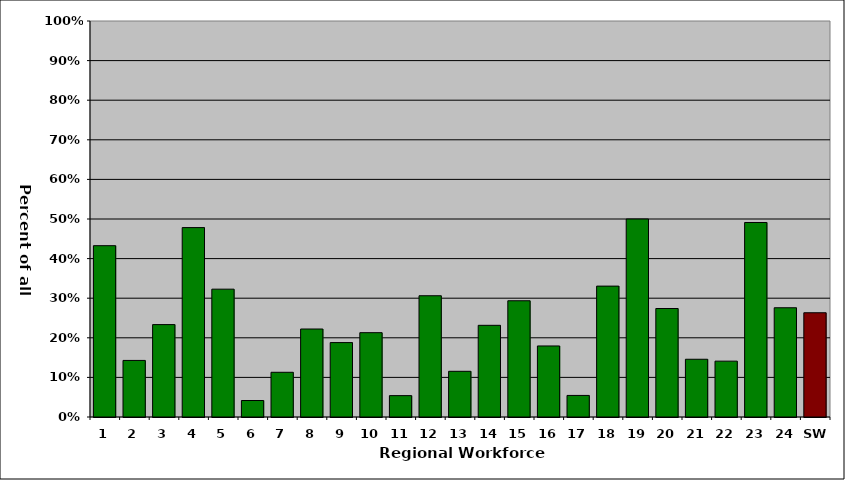
| Category | Series 0 |
|---|---|
| 1 | 0.433 |
| 2 | 0.143 |
| 3 | 0.233 |
| 4 | 0.478 |
| 5 | 0.323 |
| 6 | 0.042 |
| 7 | 0.113 |
| 8 | 0.222 |
| 9 | 0.188 |
| 10 | 0.213 |
| 11 | 0.054 |
| 12 | 0.306 |
| 13 | 0.115 |
| 14 | 0.231 |
| 15 | 0.294 |
| 16 | 0.179 |
| 17 | 0.054 |
| 18 | 0.331 |
| 19 | 0.5 |
| 20 | 0.274 |
| 21 | 0.146 |
| 22 | 0.141 |
| 23 | 0.491 |
| 24 | 0.276 |
| SW | 0.263 |